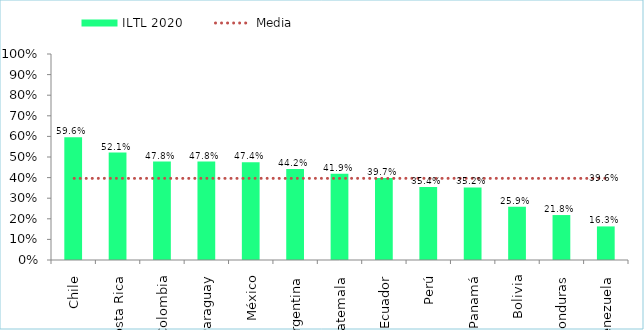
| Category | ILTL 2020 |
|---|---|
| Chile | 0.596 |
| Costa Rica | 0.521 |
| Colombia | 0.478 |
| Paraguay | 0.478 |
| México | 0.474 |
| Argentina | 0.442 |
| Guatemala | 0.419 |
| Ecuador | 0.397 |
| Perú | 0.354 |
| Panamá | 0.352 |
| Bolivia | 0.259 |
| Honduras | 0.218 |
| Venezuela | 0.163 |